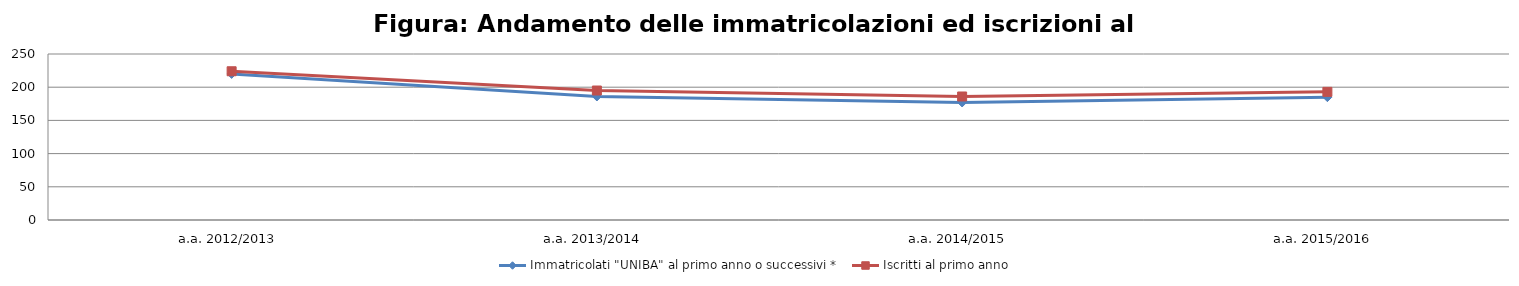
| Category | Immatricolati "UNIBA" al primo anno o successivi * | Iscritti al primo anno  |
|---|---|---|
| a.a. 2012/2013 | 220 | 224 |
| a.a. 2013/2014 | 186 | 195 |
| a.a. 2014/2015 | 177 | 186 |
| a.a. 2015/2016 | 185 | 193 |